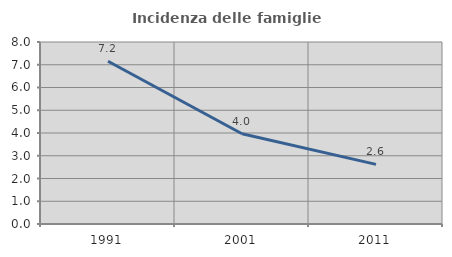
| Category | Incidenza delle famiglie numerose |
|---|---|
| 1991.0 | 7.151 |
| 2001.0 | 3.967 |
| 2011.0 | 2.622 |